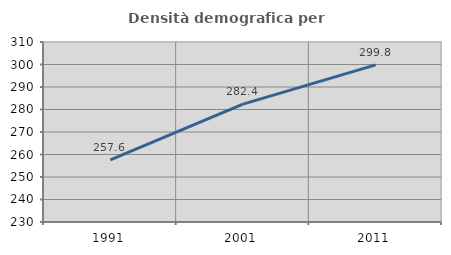
| Category | Densità demografica |
|---|---|
| 1991.0 | 257.579 |
| 2001.0 | 282.372 |
| 2011.0 | 299.806 |